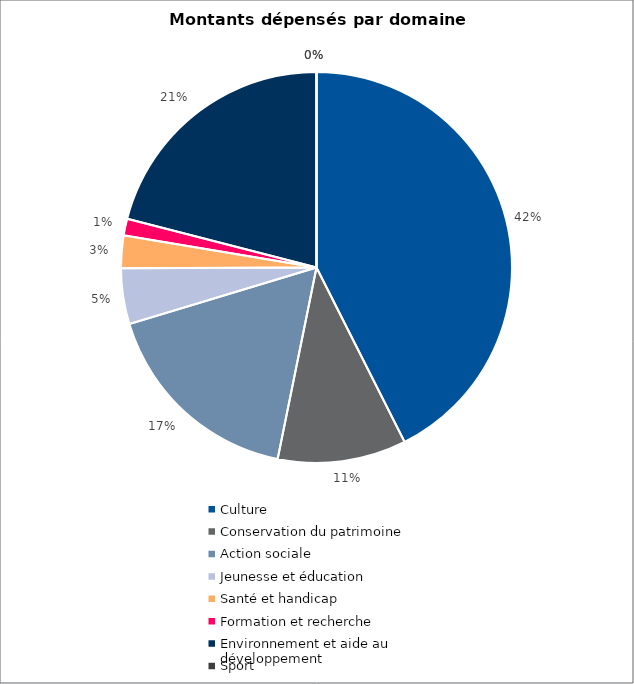
| Category | Series 0 |
|---|---|
| Culture | 8682518 |
| Conservation du patrimoine | 2169000 |
| Action sociale | 3497152 |
| Jeunesse et éducation | 942040 |
| Santé et handicap | 548000 |
| Formation et recherche | 282400 |
| Environnement et aide au
développement | 4281500 |
| Sport | 0 |
| Autres projets d’utilité publique | 0 |